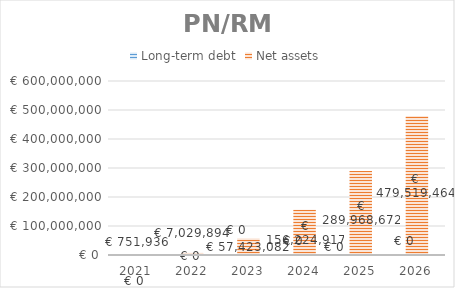
| Category | Long-term debt | Net assets |
|---|---|---|
| 2021.0 | 0 | 751936.361 |
| 2022.0 | 0 | 7029894.054 |
| 2023.0 | 0 | 57423082.249 |
| 2024.0 | 0 | 156224917.235 |
| 2025.0 | 0 | 289968671.846 |
| 2026.0 | 0 | 479519463.774 |